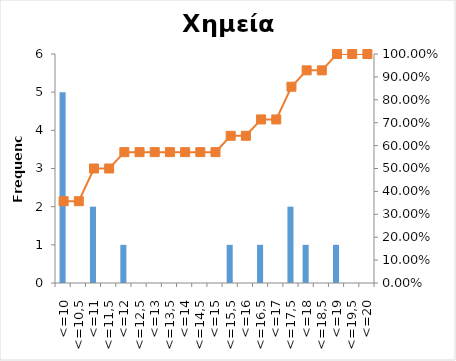
| Category | Series 0 |
|---|---|
| <=10 | 5 |
| <=10,5 | 0 |
| <=11 | 2 |
| <=11,5 | 0 |
| <=12 | 1 |
| <=12,5 | 0 |
| <=13 | 0 |
| <=13,5 | 0 |
| <=14 | 0 |
| <=14,5 | 0 |
| <=15 | 0 |
| <=15,5 | 1 |
| <=16 | 0 |
| <=16,5 | 1 |
| <=17 | 0 |
| <=17,5 | 2 |
| <=18 | 1 |
| <=18,5 | 0 |
| <=19 | 1 |
| <=19,5 | 0 |
| <=20 | 0 |